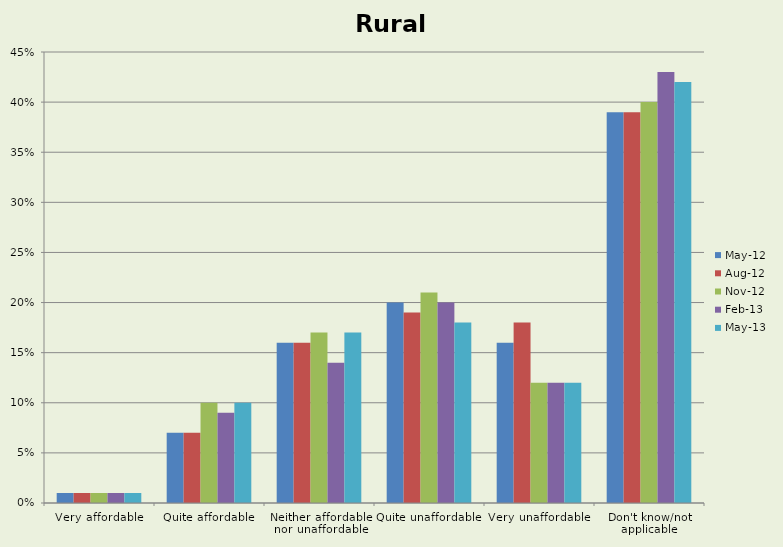
| Category | May-12 | Aug-12 | Nov-12 | Feb-13 | May-13 |
|---|---|---|---|---|---|
| Very affordable | 0.01 | 0.01 | 0.01 | 0.01 | 0.01 |
| Quite affordable | 0.07 | 0.07 | 0.1 | 0.09 | 0.1 |
| Neither affordable nor unaffordable | 0.16 | 0.16 | 0.17 | 0.14 | 0.17 |
| Quite unaffordable | 0.2 | 0.19 | 0.21 | 0.2 | 0.18 |
| Very unaffordable | 0.16 | 0.18 | 0.12 | 0.12 | 0.12 |
| Don't know/not applicable | 0.39 | 0.39 | 0.4 | 0.43 | 0.42 |